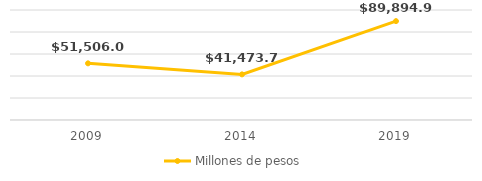
| Category | Millones de pesos |
|---|---|
| 2009.0 | 51506.031 |
| 2014.0 | 41473.716 |
| 2019.0 | 89894.907 |